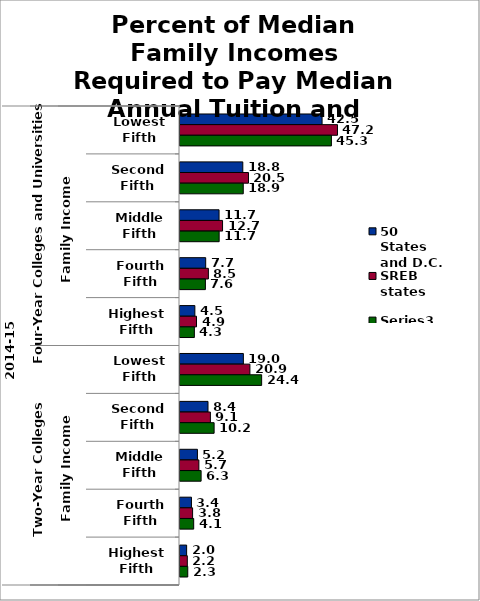
| Category | 50 States and D.C. | SREB states | Series 2 |
|---|---|---|---|
| 0 | 42.541 | 47.153 | 45.331 |
| 1 | 18.802 | 20.504 | 18.941 |
| 2 | 11.697 | 12.741 | 11.724 |
| 3 | 7.692 | 8.5 | 7.606 |
| 4 | 4.453 | 4.941 | 4.304 |
| 5 | 18.974 | 20.931 | 24.447 |
| 6 | 8.386 | 9.102 | 10.215 |
| 7 | 5.217 | 5.656 | 6.323 |
| 8 | 3.431 | 3.773 | 4.102 |
| 9 | 1.986 | 2.193 | 2.321 |